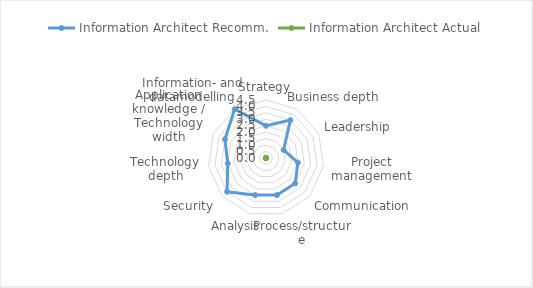
| Category | Information Architect |
|---|---|
| Strategy |  |
| Business depth |  |
| Leadership |  |
| Project management |  |
| Communication |  |
| Process/structure |  |
| Analysis |  |
| Security |  |
| Technology depth |  |
| Application knowledge / Technology width |  |
| Information- and datamodelling |  |